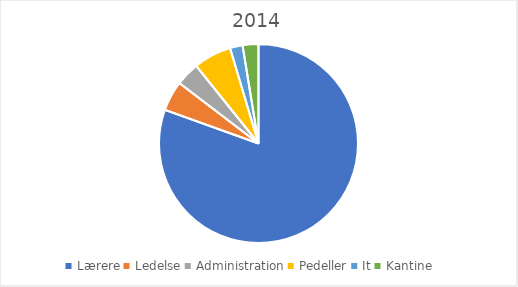
| Category | Series 0 |
|---|---|
| Lærere | 78.5 |
| Ledelse | 4.76 |
| Administration | 3.76 |
| Pedeller | 6 |
| It | 2 |
| Kantine | 2.5 |